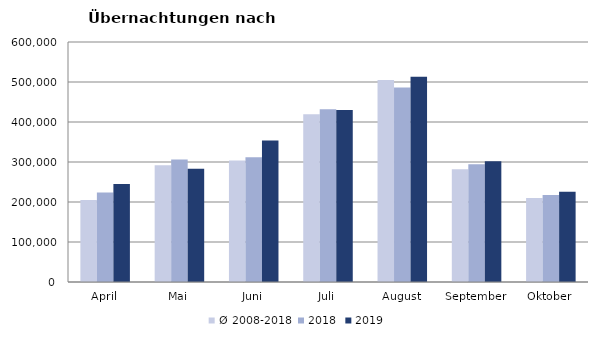
| Category | Ø 2008-2018 | 2018 | 2019 |
|---|---|---|---|
| April | 204805.273 | 224025 | 244826 |
| Mai | 292060 | 306488 | 283418 |
| Juni | 303527.545 | 312160 | 353757 |
| Juli | 419101.455 | 431967 | 430134 |
| August | 504986.091 | 486508 | 513292 |
| September | 282073.364 | 294404 | 301838 |
| Oktober | 210252.364 | 217367 | 225619 |